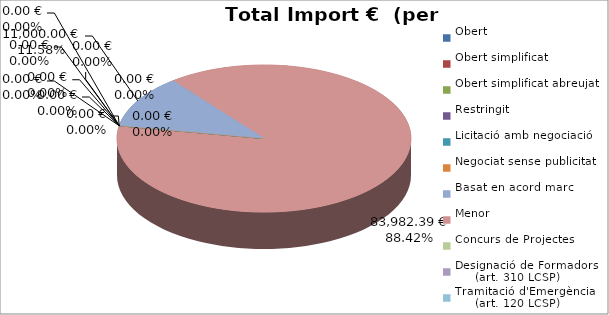
| Category | Total preu
(amb IVA) |
|---|---|
| Obert | 0 |
| Obert simplificat | 0 |
| Obert simplificat abreujat | 0 |
| Restringit | 0 |
| Licitació amb negociació | 0 |
| Negociat sense publicitat | 0 |
| Basat en acord marc | 11000 |
| Menor | 83982.39 |
| Concurs de Projectes | 0 |
| Designació de Formadors
     (art. 310 LCSP) | 0 |
| Tramitació d'Emergència
     (art. 120 LCSP) | 0 |